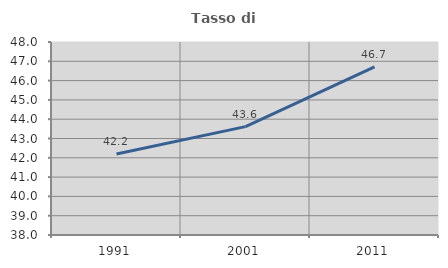
| Category | Tasso di occupazione   |
|---|---|
| 1991.0 | 42.2 |
| 2001.0 | 43.614 |
| 2011.0 | 46.706 |